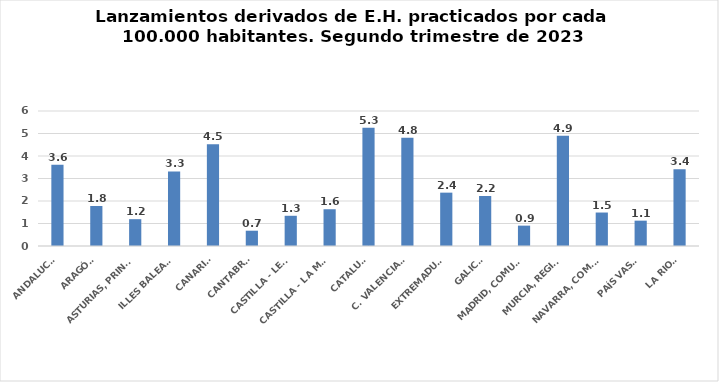
| Category | Series 0 |
|---|---|
| ANDALUCÍA | 3.613 |
| ARAGÓN | 1.779 |
| ASTURIAS, PRINCIPADO | 1.192 |
| ILLES BALEARS | 3.315 |
| CANARIAS | 4.519 |
| CANTABRIA | 0.68 |
| CASTILLA - LEÓN | 1.343 |
| CASTILLA - LA MANCHA | 1.634 |
| CATALUÑA | 5.254 |
| C. VALENCIANA | 4.81 |
| EXTREMADURA | 2.371 |
| GALICIA | 2.222 |
| MADRID, COMUNIDAD | 0.905 |
| MURCIA, REGIÓN | 4.895 |
| NAVARRA, COM. FORAL | 1.488 |
| PAÍS VASCO | 1.126 |
| LA RIOJA | 3.413 |